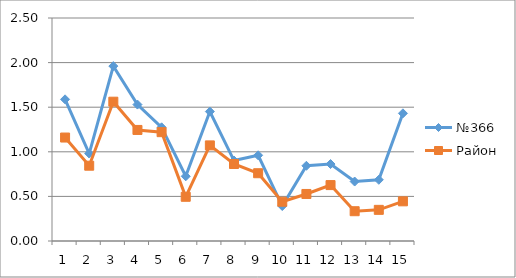
| Category | №366 | Район |
|---|---|---|
| 0 | 1.588 | 1.16 |
| 1 | 0.98 | 0.844 |
| 2 | 1.961 | 1.562 |
| 3 | 1.529 | 1.245 |
| 4 | 1.275 | 1.22 |
| 5 | 0.725 | 0.496 |
| 6 | 1.451 | 1.072 |
| 7 | 0.902 | 0.863 |
| 8 | 0.961 | 0.76 |
| 9 | 0.392 | 0.44 |
| 10 | 0.843 | 0.527 |
| 11 | 0.863 | 0.627 |
| 12 | 0.667 | 0.334 |
| 13 | 0.686 | 0.349 |
| 14 | 1.431 | 0.445 |